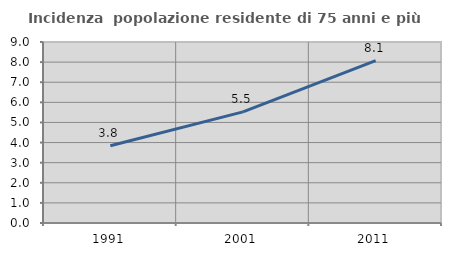
| Category | Incidenza  popolazione residente di 75 anni e più |
|---|---|
| 1991.0 | 3.838 |
| 2001.0 | 5.526 |
| 2011.0 | 8.073 |